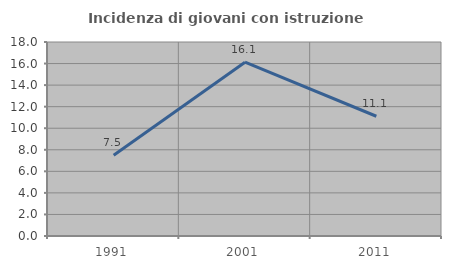
| Category | Incidenza di giovani con istruzione universitaria |
|---|---|
| 1991.0 | 7.5 |
| 2001.0 | 16.129 |
| 2011.0 | 11.111 |